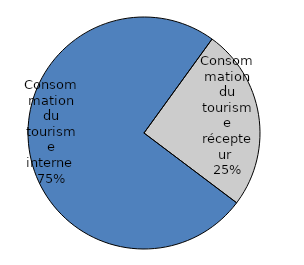
| Category | Series 0 |
|---|---|
| Comsommation du tourisme interne | 0.747 |
| Consommation du tourisme récepteur | 0.253 |